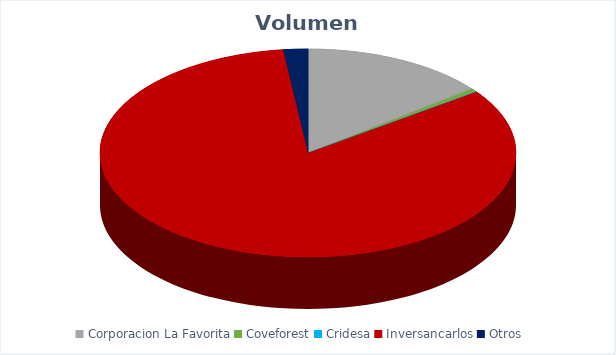
| Category | VOLUMEN ($USD) |
|---|---|
| Corporacion La Favorita | 75054.18 |
| Coveforest | 2600 |
| Cridesa | 447.3 |
| Inversancarlos | 432405 |
| Otros | 9942.5 |